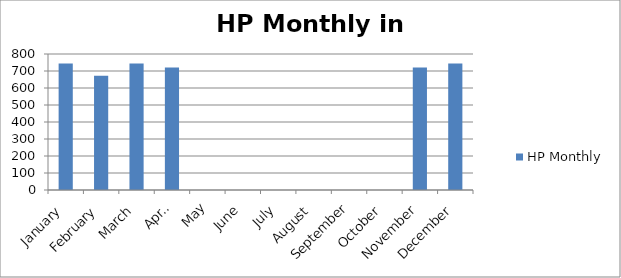
| Category | HP Monthly |
|---|---|
| January | 744 |
| February | 672 |
| March | 744 |
| April | 720 |
| May | 0 |
| June | 0 |
| July | 0 |
| August | 0 |
| September | 0 |
| October | 0 |
| November | 720 |
| December | 744 |